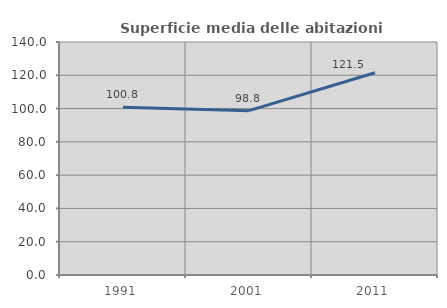
| Category | Superficie media delle abitazioni occupate |
|---|---|
| 1991.0 | 100.784 |
| 2001.0 | 98.757 |
| 2011.0 | 121.521 |